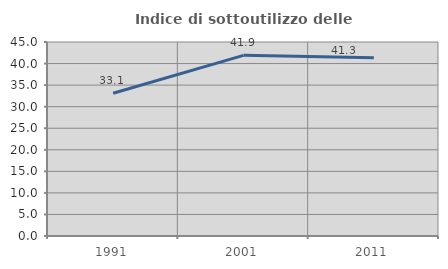
| Category | Indice di sottoutilizzo delle abitazioni  |
|---|---|
| 1991.0 | 33.101 |
| 2001.0 | 41.907 |
| 2011.0 | 41.327 |